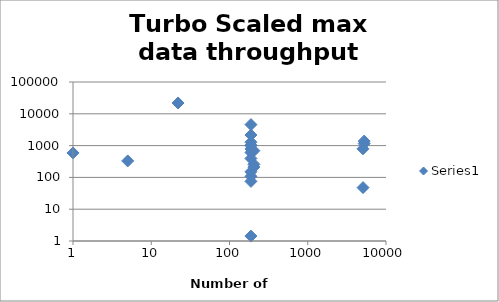
| Category | Series 0 |
|---|---|
| 5263.0 | 1388 |
| 5075.0 | 792 |
| 5263.0 | 1156.154 |
| 205.0 | 691.7 |
| 188.0 | 1013 |
| 188.0 | 781.2 |
| 188.0 | 393.785 |
| 205.0 | 257.677 |
| 188.0 | 1.426 |
| 5092.0 | 47.8 |
| 205.0 | 211.2 |
| 188.0 | 607.611 |
| 188.0 | 4578.923 |
| 22.0 | 21900 |
| 188.0 | 2150 |
| 188.0 | 1280 |
| 188.0 | 1013 |
| 188.0 | 150 |
| 188.0 | 108 |
| 188.0 | 75 |
| 5.0 | 329.231 |
| 1.0 | 588.462 |